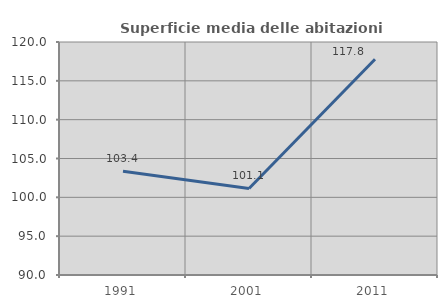
| Category | Superficie media delle abitazioni occupate |
|---|---|
| 1991.0 | 103.361 |
| 2001.0 | 101.14 |
| 2011.0 | 117.778 |